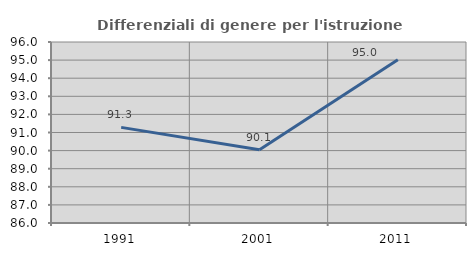
| Category | Differenziali di genere per l'istruzione superiore |
|---|---|
| 1991.0 | 91.283 |
| 2001.0 | 90.051 |
| 2011.0 | 95.018 |